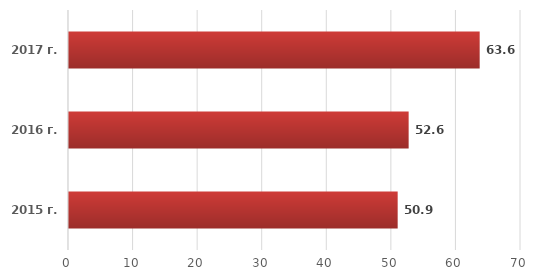
| Category | Series 0 |
|---|---|
| 2015 г. | 50.9 |
| 2016 г. | 52.6 |
| 2017 г. | 63.6 |